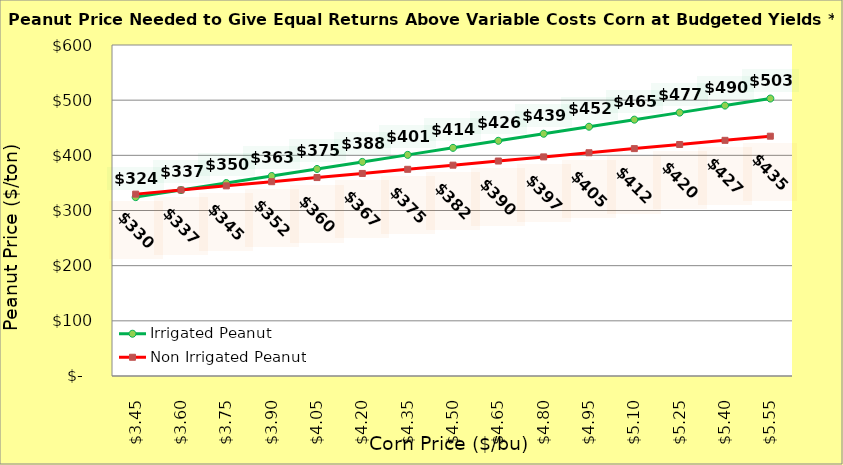
| Category | Irrigated Peanut | Non Irrigated Peanut |
|---|---|---|
| 3.4499999999999993 | 324.231 | 329.681 |
| 3.599999999999999 | 336.997 | 337.181 |
| 3.749999999999999 | 349.763 | 344.681 |
| 3.899999999999999 | 362.529 | 352.181 |
| 4.049999999999999 | 375.295 | 359.681 |
| 4.199999999999999 | 388.061 | 367.181 |
| 4.35 | 400.826 | 374.681 |
| 4.5 | 413.592 | 382.181 |
| 4.65 | 426.358 | 389.681 |
| 4.800000000000001 | 439.124 | 397.181 |
| 4.950000000000001 | 451.89 | 404.681 |
| 5.100000000000001 | 464.656 | 412.181 |
| 5.250000000000002 | 477.422 | 419.681 |
| 5.400000000000002 | 490.188 | 427.181 |
| 5.5500000000000025 | 502.954 | 434.681 |